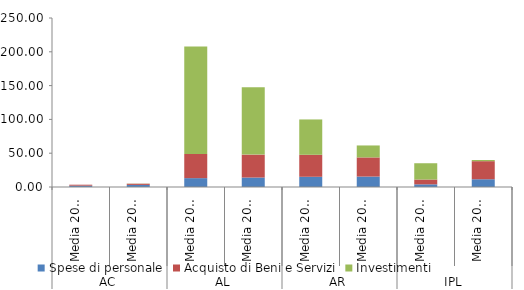
| Category | Spese di personale | Acquisto di Beni e Servizi | Investimenti |
|---|---|---|---|
| 0 | 1.971 | 1.426 | 0.033 |
| 1 | 3.099 | 1.761 | 0.205 |
| 2 | 13.104 | 35.759 | 158.823 |
| 3 | 14.007 | 33.91 | 99.549 |
| 4 | 15.126 | 32.53 | 52.266 |
| 5 | 15.445 | 28.323 | 17.686 |
| 6 | 3.936 | 7.117 | 24.094 |
| 7 | 11.469 | 26.736 | 1.713 |